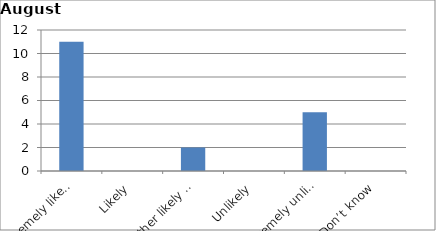
| Category | Series 0 |
|---|---|
| Extremely likely | 11 |
| Likely | 0 |
| Neither likely nor unlikely | 2 |
| Unlikely | 0 |
| Extremely unlikely | 5 |
| Don’t know | 0 |